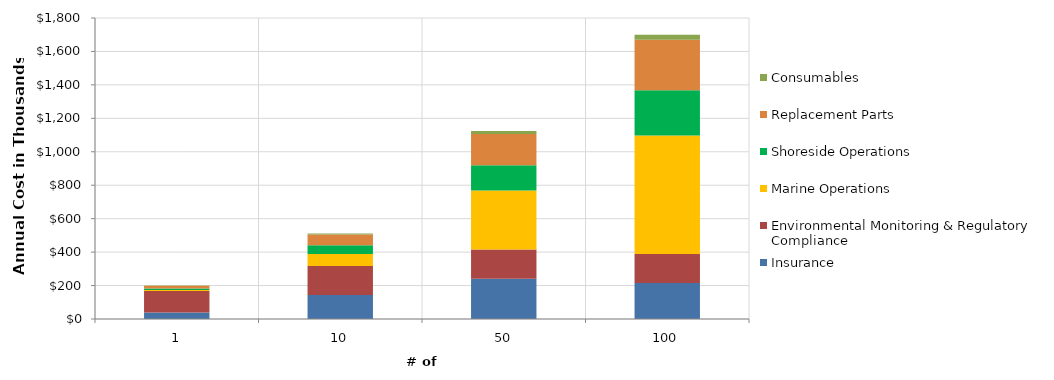
| Category | Insurance | Environmental Monitoring & Regulatory Compliance | Marine Operations | Shoreside Operations | Replacement Parts | Consumables |
|---|---|---|---|---|---|---|
| 1.0 | 39 | 128 | 7 | 9 | 16 | 2 |
| 10.0 | 143 | 174 | 71 | 53 | 64 | 6 |
| 50.0 | 241 | 174 | 354 | 151 | 186 | 19 |
| 100.0 | 215 | 174 | 708 | 271 | 302 | 30 |